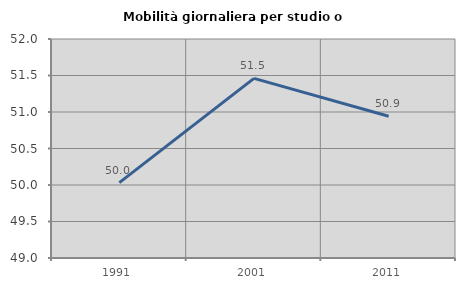
| Category | Mobilità giornaliera per studio o lavoro |
|---|---|
| 1991.0 | 50.032 |
| 2001.0 | 51.46 |
| 2011.0 | 50.942 |